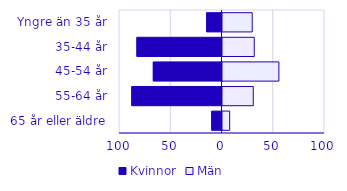
| Category | Kvinnor | Män |
|---|---|---|
| 0 | -15 | 29 |
| 1 | -83 | 31 |
| 2 | -67 | 55 |
| 3 | -88 | 30 |
| 4 | -10 | 7 |